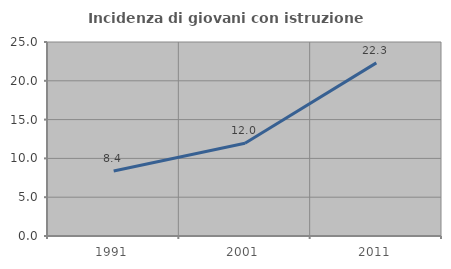
| Category | Incidenza di giovani con istruzione universitaria |
|---|---|
| 1991.0 | 8.365 |
| 2001.0 | 11.963 |
| 2011.0 | 22.311 |